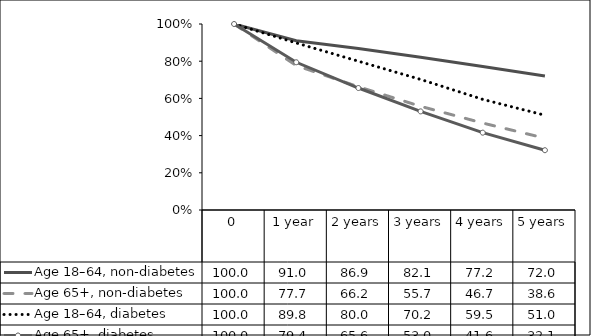
| Category | Age 18–64, non-diabetes | Age 65+, non-diabetes | Age 18–64, diabetes | Age 65+, diabetes |
|---|---|---|---|---|
| 0 | 100 | 100 | 100 | 100 |
| 1 year | 91.006 | 77.662 | 89.804 | 79.422 |
| 2 years | 86.866 | 66.247 | 79.982 | 65.581 |
| 3 years | 82.077 | 55.75 | 70.199 | 53.018 |
| 4 years | 77.197 | 46.746 | 59.483 | 41.581 |
| 5 years | 72.048 | 38.61 | 50.958 | 32.148 |